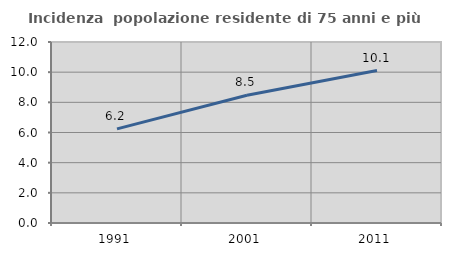
| Category | Incidenza  popolazione residente di 75 anni e più |
|---|---|
| 1991.0 | 6.241 |
| 2001.0 | 8.469 |
| 2011.0 | 10.11 |